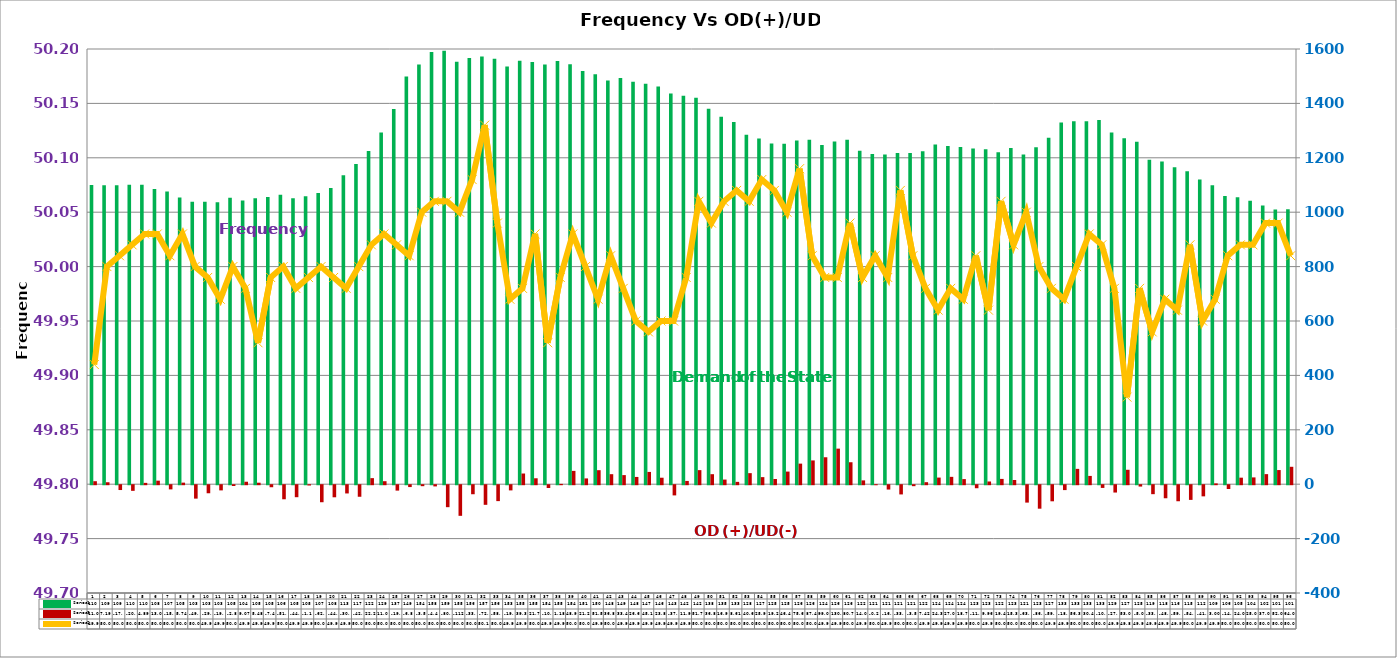
| Category | Series 2 | Series 4 |
|---|---|---|
| 0 | 1100 | 11.001 |
| 1 | 1099 | 7.191 |
| 2 | 1099 | -17.774 |
| 3 | 1101 | -20.741 |
| 4 | 1101 | 4.888 |
| 5 | 1085 | 13.004 |
| 6 | 1076 | -15.407 |
| 7 | 1054 | 5.743 |
| 8 | 1038 | -49.339 |
| 9 | 1038 | -29.64 |
| 10 | 1037 | -19.067 |
| 11 | 1053 | -2.867 |
| 12 | 1043 | 9.074 |
| 13 | 1051 | 5.481 |
| 14 | 1056 | -7.485 |
| 15 | 1064 | -51.748 |
| 16 | 1051 | -44.144 |
| 17 | 1059 | -1.121 |
| 18 | 1071 | -62.62 |
| 19 | 1089 | -44.438 |
| 20 | 1136 | -30.329 |
| 21 | 1177 | -42.507 |
| 22 | 1225 | 22.283 |
| 23 | 1293 | 11.035 |
| 24 | 1379 | -19.869 |
| 25 | 1499 | -6.868 |
| 26 | 1543 | -3.59 |
| 27 | 1589 | -4.434 |
| 28 | 1594 | -80.804 |
| 29 | 1553 | -112.602 |
| 30 | 1567 | -33.227 |
| 31 | 1572 | -72.104 |
| 32 | 1564 | -58.521 |
| 33 | 1536 | -19.079 |
| 34 | 1557 | 39.298 |
| 35 | 1552 | 21.777 |
| 36 | 1543 | -10.284 |
| 37 | 1556 | 1.176 |
| 38 | 1544 | 48.949 |
| 39 | 1519 | 21.258 |
| 40 | 1507 | 51.522 |
| 41 | 1484 | 36.834 |
| 42 | 1493 | 33.431 |
| 43 | 1480 | 26.69 |
| 44 | 1472 | 45.125 |
| 45 | 1462 | 23.825 |
| 46 | 1436 | -37.499 |
| 47 | 1428 | 11.98 |
| 48 | 1421 | 51.738 |
| 49 | 1380 | 36.816 |
| 50 | 1351 | 16.99 |
| 51 | 1332 | 8.61 |
| 52 | 1285 | 40.638 |
| 53 | 1271 | 25.971 |
| 54 | 1253 | 19.208 |
| 55 | 1252 | 46.409 |
| 56 | 1264 | 75.635 |
| 57 | 1266 | 87.405 |
| 58 | 1247 | 99.038 |
| 59 | 1260 | 130.768 |
| 60 | 1266 | 80.73 |
| 61 | 1226 | 14.044 |
| 62 | 1214 | -0.199 |
| 63 | 1212 | -16 |
| 64 | 1218 | -33.925 |
| 65 | 1218 | -3.575 |
| 66 | 1224 | 7.418 |
| 67 | 1249 | 24.337 |
| 68 | 1243 | 27.02 |
| 69 | 1240 | 18.749 |
| 70 | 1234 | -11.142 |
| 71 | 1231 | 9.957 |
| 72 | 1220 | 19.457 |
| 73 | 1236 | 15.363 |
| 74 | 1212 | -63.987 |
| 75 | 1239 | -86.368 |
| 76 | 1274 | -59.196 |
| 77 | 1330 | -18.005 |
| 78 | 1334 | 56.389 |
| 79 | 1334 | 30.45 |
| 80 | 1339 | -10 |
| 81 | 1293 | -27 |
| 82 | 1272 | 53 |
| 83 | 1259 | -5 |
| 84 | 1193 | -33 |
| 85 | 1186 | -48 |
| 86 | 1165 | -59 |
| 87 | 1151 | -54 |
| 88 | 1120 | -41 |
| 89 | 1099 | 3 |
| 90 | 1060 | -14 |
| 91 | 1055 | 24 |
| 92 | 1042 | 25 |
| 93 | 1025 | 37 |
| 94 | 1010 | 52 |
| 95 | 1011 | 64 |